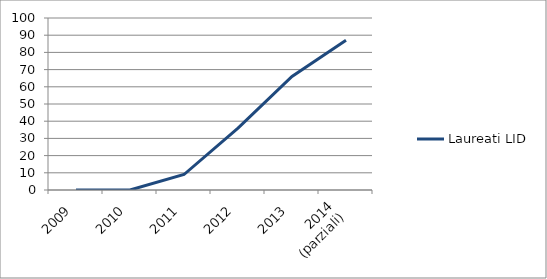
| Category | Laureati LID |
|---|---|
| 2009 | 0 |
| 2010 | 0 |
| 2011 | 9 |
| 2012 | 36 |
| 2013 | 66 |
| 2014
(parziali) | 87 |